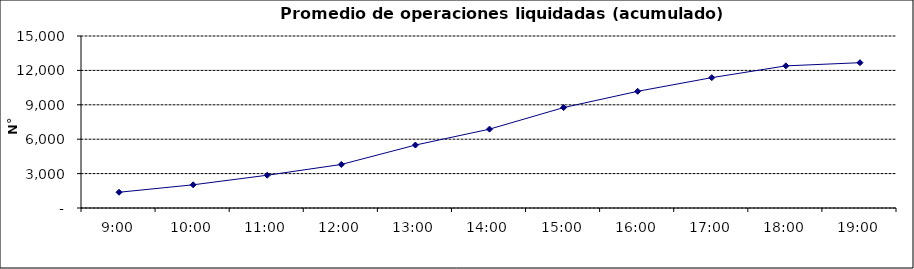
| Category | Promedio Op.Liquidadas (acumulado) |
|---|---|
| 0.375 | 1372.619 |
| 0.4166666666666667 | 2023.333 |
| 0.4583333333333333 | 2858 |
| 0.5 | 3797.143 |
| 0.5416666666666666 | 5488.714 |
| 0.5833333333333334 | 6876.095 |
| 0.625 | 8758.476 |
| 0.6666666666666666 | 10176.714 |
| 0.7083333333333334 | 11367.476 |
| 0.75 | 12395.905 |
| 0.7916666666666666 | 12672.571 |